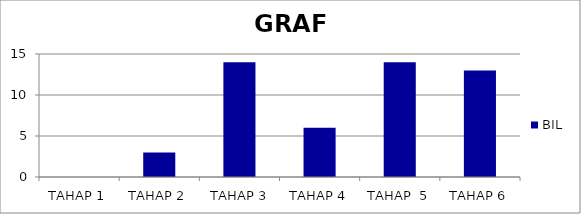
| Category | BIL |
|---|---|
| TAHAP 1 | 0 |
| TAHAP 2 | 3 |
|  TAHAP 3 | 14 |
| TAHAP 4 | 6 |
| TAHAP  5 | 14 |
| TAHAP 6 | 13 |